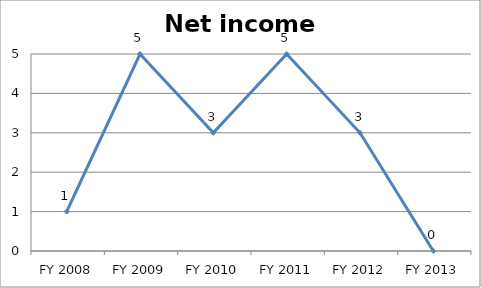
| Category | Net income score |
|---|---|
| FY 2013 | 0 |
| FY 2012 | 3 |
| FY 2011 | 5 |
| FY 2010 | 3 |
| FY 2009 | 5 |
| FY 2008 | 1 |